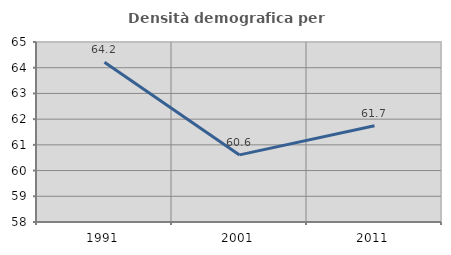
| Category | Densità demografica |
|---|---|
| 1991.0 | 64.208 |
| 2001.0 | 60.61 |
| 2011.0 | 61.746 |